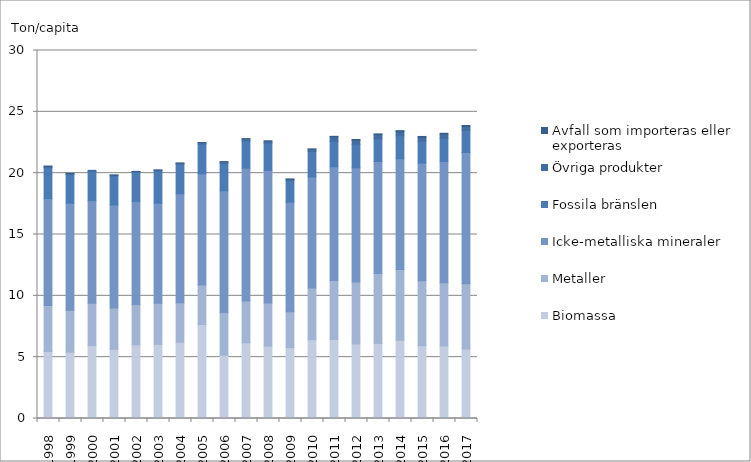
| Category | Biomassa | Metaller | Icke-metalliska mineraler | Fossila bränslen | Övriga produkter | Avfall som importeras eller exporteras |
|---|---|---|---|---|---|---|
| 1998.0 | 5.461 | 3.741 | 8.723 | 2.519 | 0.122 | 0 |
| 1999.0 | 5.407 | 3.428 | 8.719 | 2.34 | 0.088 | 0 |
| 2000.0 | 5.943 | 3.462 | 8.355 | 2.372 | 0.099 | 0 |
| 2001.0 | 5.643 | 3.365 | 8.401 | 2.374 | 0.062 | 0 |
| 2002.0 | 6.012 | 3.291 | 8.398 | 2.382 | 0.059 | 0 |
| 2003.0 | 6.044 | 3.362 | 8.144 | 2.651 | 0.053 | 0 |
| 2004.0 | 6.218 | 3.218 | 8.883 | 2.423 | 0.078 | 0 |
| 2005.0 | 7.659 | 3.218 | 9.077 | 2.418 | 0.122 | 0.002 |
| 2006.0 | 5.161 | 3.471 | 9.93 | 2.256 | 0.11 | 0.001 |
| 2007.0 | 6.17 | 3.406 | 10.832 | 2.219 | 0.177 | 0.001 |
| 2008.0 | 5.894 | 3.517 | 10.817 | 2.227 | 0.166 | 0.003 |
| 2009.0 | 5.778 | 2.934 | 8.921 | 1.764 | 0.11 | 0.017 |
| 2010.0 | 6.423 | 4.221 | 9.051 | 2.085 | 0.167 | 0.031 |
| 2011.0 | 6.45 | 4.806 | 9.27 | 2.071 | 0.357 | 0.049 |
| 2012.0 | 6.075 | 5.049 | 9.31 | 1.912 | 0.341 | 0.056 |
| 2013.0 | 6.12 | 5.704 | 9.13 | 1.845 | 0.346 | 0.058 |
| 2014.0 | 6.371 | 5.773 | 9.03 | 1.866 | 0.36 | 0.068 |
| 2015.0 | 5.936 | 5.292 | 9.593 | 1.781 | 0.324 | 0.068 |
| 2016.0 | 5.912 | 5.153 | 9.889 | 1.887 | 0.338 | 0.071 |
| 2017.0 | 5.661 | 5.325 | 10.7 | 1.805 | 0.323 | 0.075 |